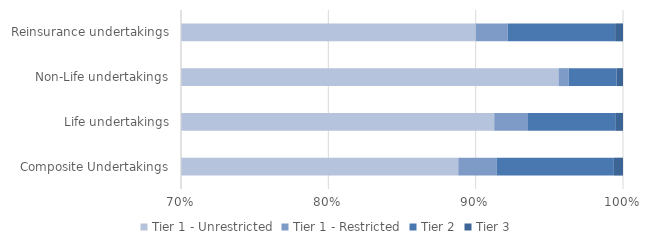
| Category | Tier 1 - Unrestricted | Tier 1 - Restricted | Tier 2 | Tier 3 |
|---|---|---|---|---|
| Composite Undertakings | 398781.21 | 11647.04 | 35764.45 | 2785.37 |
| Life undertakings | 417535.61 | 10292.72 | 27486.43 | 2215.46 |
| Non-Life undertakings | 439595.63 | 3206.94 | 14950 | 1966.24 |
| Reinsurance undertakings | 221711.11 | 5325.58 | 17973.48 | 1309.93 |